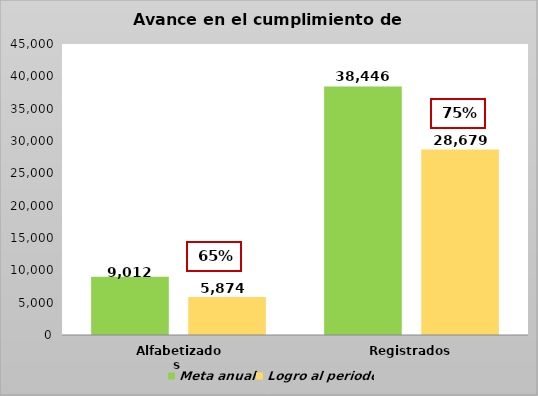
| Category | Meta anual | Logro al periodo |
|---|---|---|
| Alfabetizados  | 9012 | 5874 |
| Registrados | 38446 | 28679 |